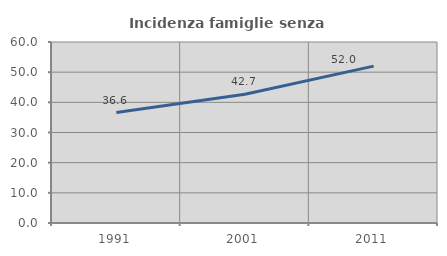
| Category | Incidenza famiglie senza nuclei |
|---|---|
| 1991.0 | 36.608 |
| 2001.0 | 42.695 |
| 2011.0 | 52 |